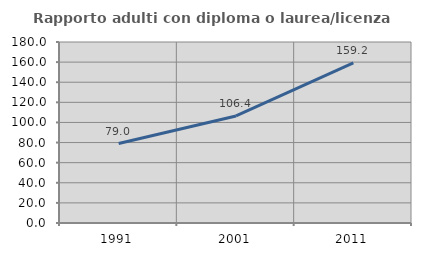
| Category | Rapporto adulti con diploma o laurea/licenza media  |
|---|---|
| 1991.0 | 79.038 |
| 2001.0 | 106.426 |
| 2011.0 | 159.209 |